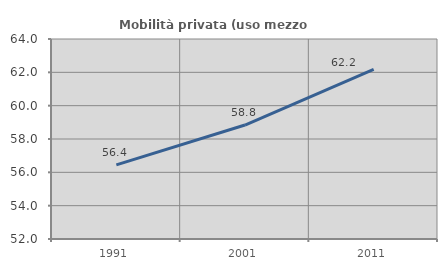
| Category | Mobilità privata (uso mezzo privato) |
|---|---|
| 1991.0 | 56.448 |
| 2001.0 | 58.837 |
| 2011.0 | 62.181 |